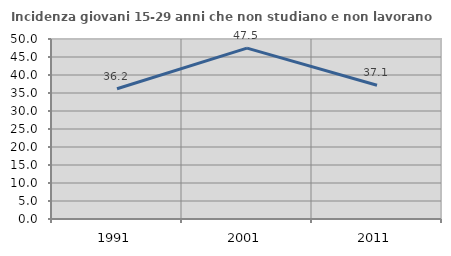
| Category | Incidenza giovani 15-29 anni che non studiano e non lavorano  |
|---|---|
| 1991.0 | 36.183 |
| 2001.0 | 47.451 |
| 2011.0 | 37.143 |